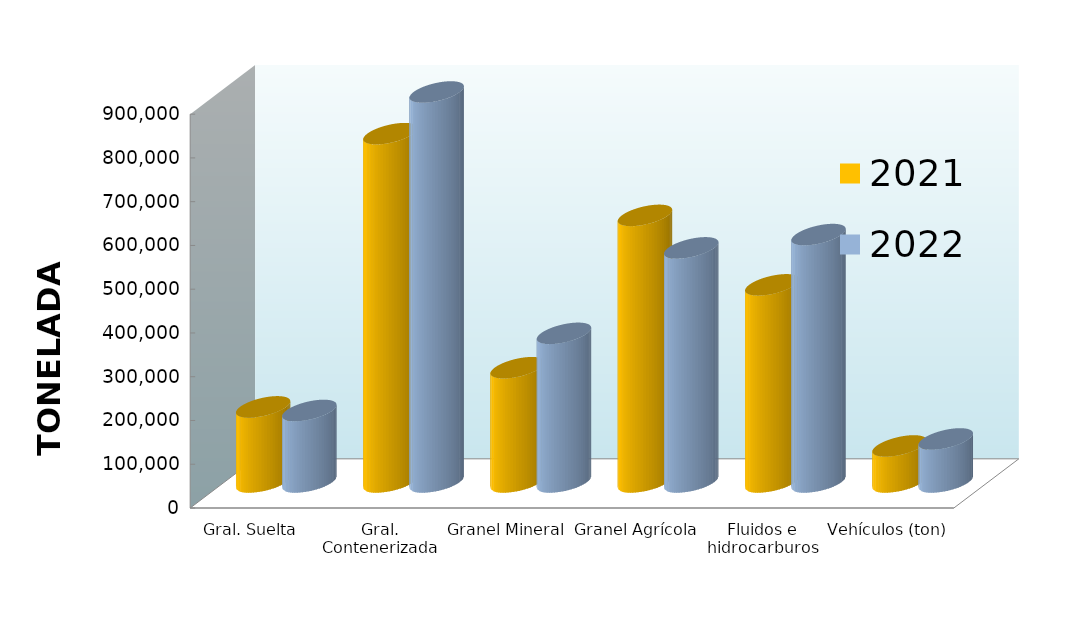
| Category | 2021 | 2022 |
|---|---|---|
| Gral. Suelta | 171664.784 | 163472.408 |
| Gral. Contenerizada | 795986.672 | 891249.39 |
| Granel Mineral | 261148.504 | 339697.44 |
| Granel Agrícola | 609265.361 | 535023.49 |
| Fluidos e hidrocarburos | 450504.855 | 565393.846 |
| Vehículos (ton) | 82364.869 | 98370.031 |